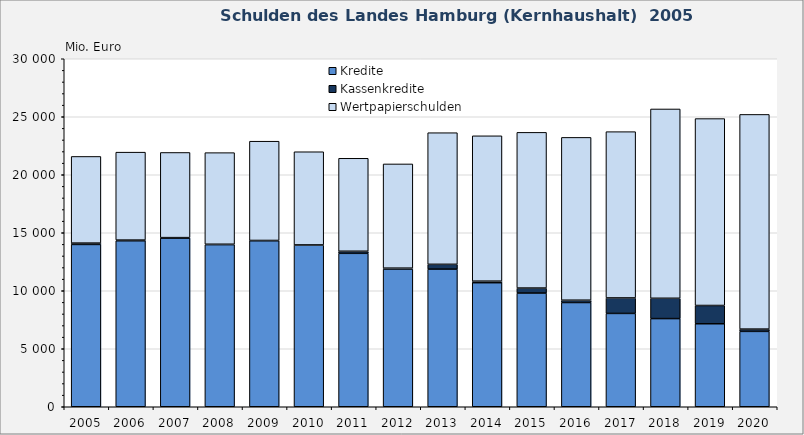
| Category | Kredite | Kassenkredite | Wertpapierschulden |
|---|---|---|---|
| 2005.0 | 13993 | 115 | 7472 |
| 2006.0 | 14309 | 58 | 7582 |
| 2007.0 | 14546 | 33 | 7343 |
| 2008.0 | 13976 | 33 | 7898 |
| 2009.0 | 14321 | 14 | 8558 |
| 2010.0 | 13949 | 2 | 8032 |
| 2011.0 | 13227 | 179 | 8015 |
| 2012.0 | 11873 | 75 | 8985 |
| 2013.0 | 11865 | 414 | 11347 |
| 2014.0 | 10695 | 131 | 12532 |
| 2015.0 | 9802 | 430 | 13423 |
| 2016.0 | 8987 | 199 | 14035 |
| 2017.0 | 8046 | 1335 | 14335 |
| 2018.0 | 7601 | 1751 | 16319 |
| 2019.0 | 7155 | 1574 | 16114 |
| 2020.0 | 6499 | 195 | 18507 |